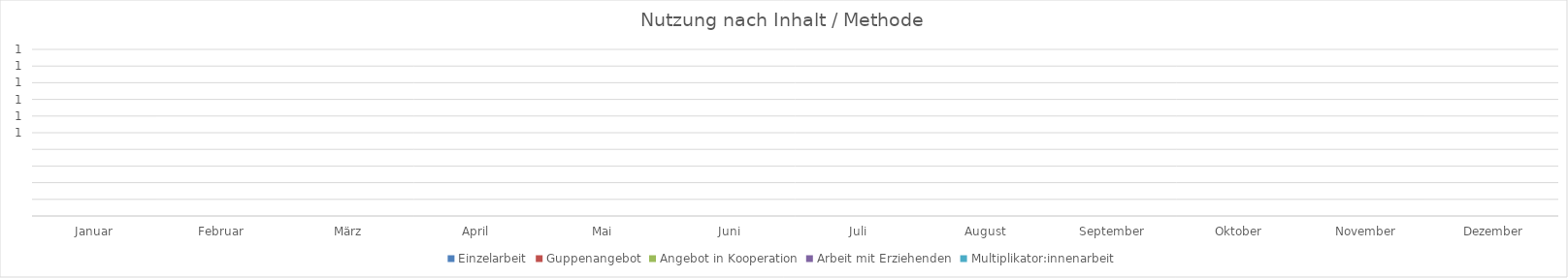
| Category | Einzelarbeit | Guppenangebot | Angebot in Kooperation | Arbeit mit Erziehenden | Multiplikator:innenarbeit |
|---|---|---|---|---|---|
| Januar | 0 | 0 | 0 | 0 | 0 |
| Februar | 0 | 0 | 0 | 0 | 0 |
| März | 0 | 0 | 0 | 0 | 0 |
| April | 0 | 0 | 0 | 0 | 0 |
| Mai | 0 | 0 | 0 | 0 | 0 |
| Juni | 0 | 0 | 0 | 0 | 0 |
| Juli | 0 | 0 | 0 | 0 | 0 |
| August | 0 | 0 | 0 | 0 | 0 |
| September | 0 | 0 | 0 | 0 | 0 |
| Oktober | 0 | 0 | 0 | 0 | 0 |
| November | 0 | 0 | 0 | 0 | 0 |
| Dezember | 0 | 0 | 0 | 0 | 0 |